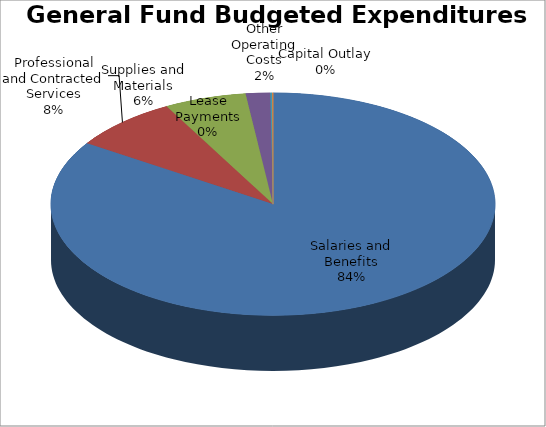
| Category | Series 0 |
|---|---|
| Salaries and Benefits | 51601966 |
| Professional and Contracted Services | 4803493 |
| Supplies and Materials | 3659645 |
| Other Operating Costs | 1085715 |
| Lease Payments | 80715 |
| Capital Outlay | 39795 |